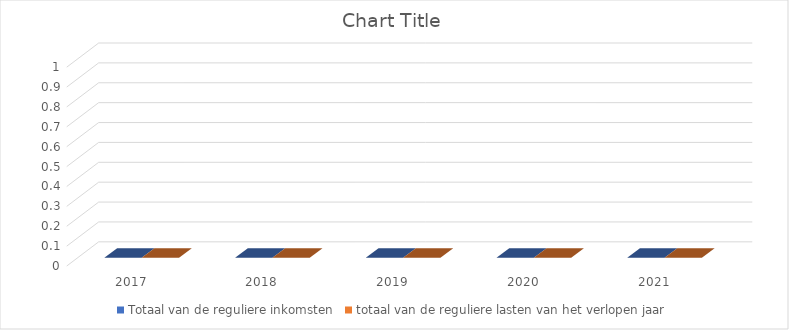
| Category | Totaal van de reguliere inkomsten | totaal van de reguliere lasten van het verlopen jaar |
|---|---|---|
| 2017 | 0 | 0 |
| 2018 | 0 | 0 |
| 2019 | 0 | 0 |
| 2020 | 0 | 0 |
| 2021 | 0 | 0 |